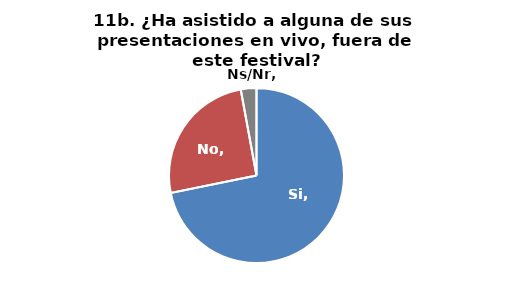
| Category | Series 0 |
|---|---|
| Si | 0.718 |
| No | 0.253 |
| Ns/Nr | 0.029 |